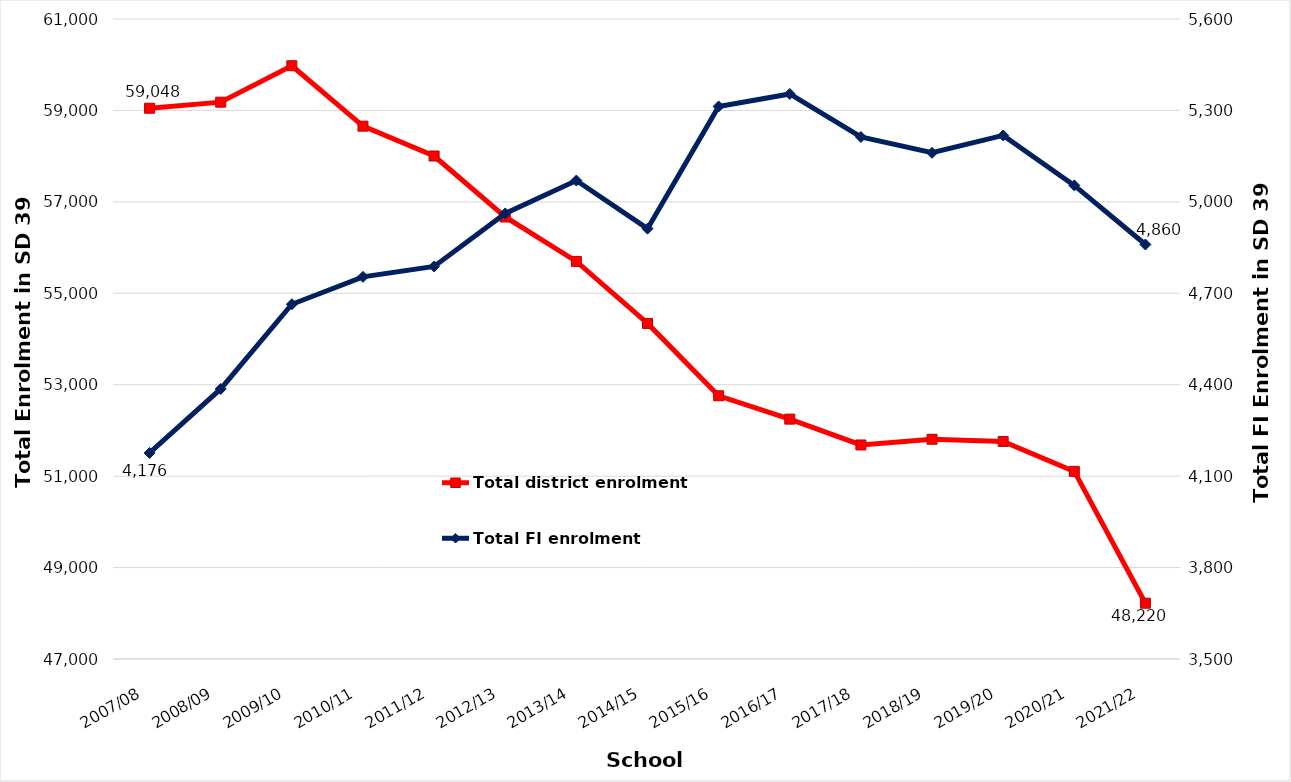
| Category | Total district enrolment  |
|---|---|
| 2007/08 | 59048 |
| 2008/09 | 59181 |
| 2009/10 | 59978 |
| 2010/11 | 58656 |
| 2011/12 | 58003 |
| 2012/13 | 56669 |
| 2013/14 | 55697 |
| 2014/15 | 54341 |
| 2015/16 | 52758 |
| 2016/17 | 52247 |
| 2017/18 | 51682 |
| 2018/19 | 51807 |
| 2019/20 | 51759 |
| 2020/21 | 51105 |
| 2021/22 | 48220 |